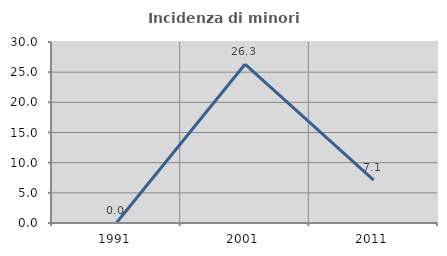
| Category | Incidenza di minori stranieri |
|---|---|
| 1991.0 | 0 |
| 2001.0 | 26.316 |
| 2011.0 | 7.092 |